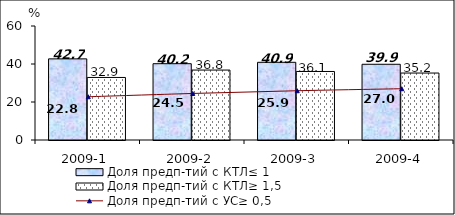
| Category | Доля предп-тий с КТЛ≤ 1 | Доля предп-тий с КТЛ≥ 1,5 |
|---|---|---|
| 2009-1 | 42.697 | 32.914 |
| 2009-2 | 40.159 | 36.816 |
| 2009-3 | 40.892 | 36.064 |
| 2009-4 | 39.855 | 35.243 |